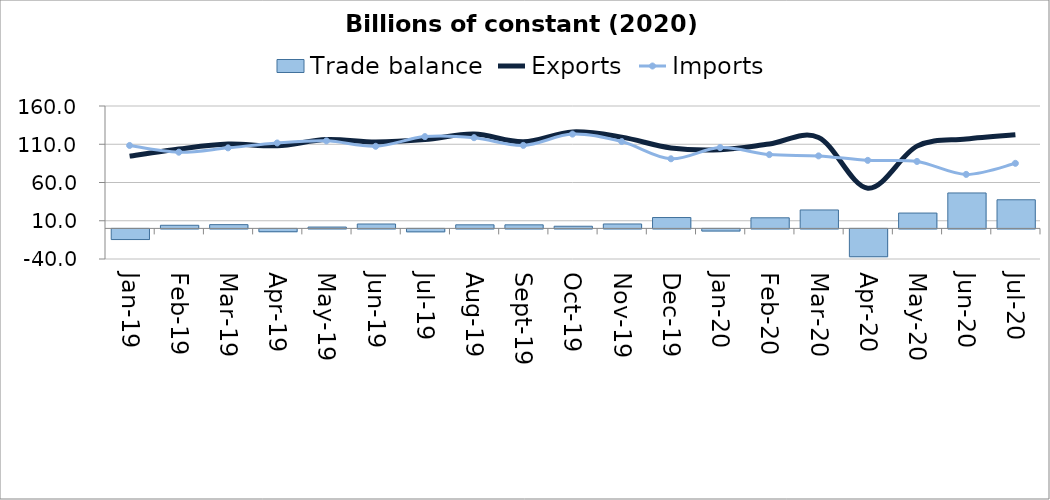
| Category | Trade balance |
|---|---|
| 2019-01-31 | -13.928 |
| 2019-02-28 | 4.088 |
| 2019-03-31 | 4.934 |
| 2019-04-30 | -3.673 |
| 2019-05-31 | 1.763 |
| 2019-06-30 | 5.738 |
| 2019-07-31 | -3.844 |
| 2019-08-31 | 4.675 |
| 2019-09-30 | 4.653 |
| 2019-10-31 | 2.824 |
| 2019-11-30 | 5.789 |
| 2019-12-01 | 14.212 |
| 2020-01-31 | -2.776 |
| 2020-02-29 | 13.854 |
| 2020-03-31 | 24.104 |
| 2020-04-30 | -36.384 |
| 2020-05-31 | 20.053 |
| 2020-06-30 | 46.328 |
| 2020-07-31 | 37.424 |